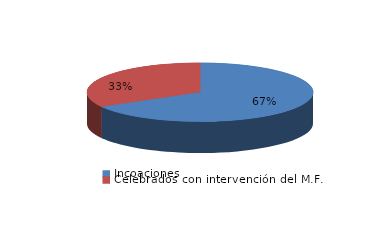
| Category | Series 0 |
|---|---|
| Incoaciones | 49643 |
| Celebrados con intervención del M.F. | 24748 |